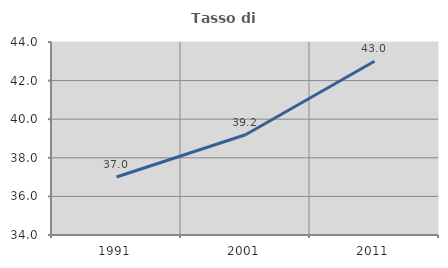
| Category | Tasso di occupazione   |
|---|---|
| 1991.0 | 37.004 |
| 2001.0 | 39.193 |
| 2011.0 | 43.005 |